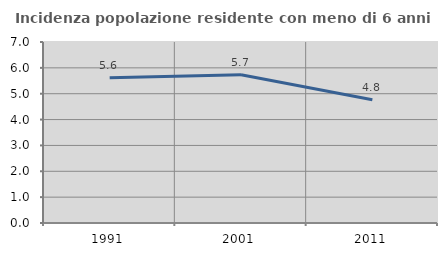
| Category | Incidenza popolazione residente con meno di 6 anni |
|---|---|
| 1991.0 | 5.62 |
| 2001.0 | 5.734 |
| 2011.0 | 4.769 |